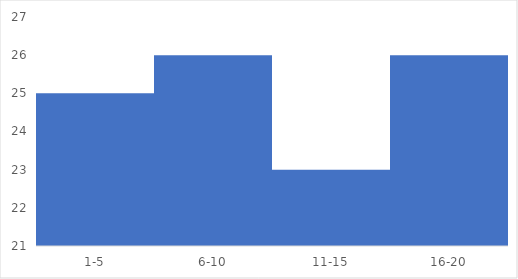
| Category | Total |
|---|---|
| 1-5 | 25 |
| 6-10 | 26 |
| 11-15 | 23 |
| 16-20 | 26 |